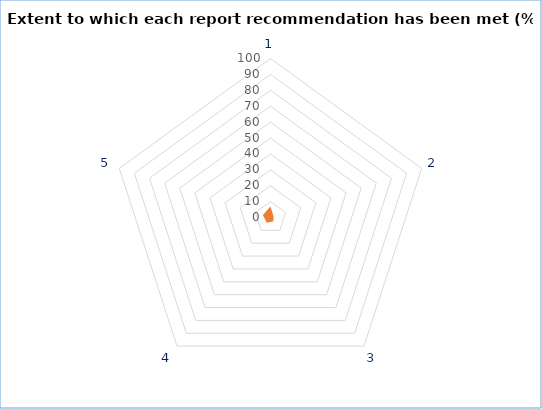
| Category | Series 1 | Series 0 |
|---|---|---|
| 0 | 7 | 0 |
| 1 | 2 | 0 |
| 2 | 3 | 0 |
| 3 | 4 | 0 |
| 4 | 5 | 0 |